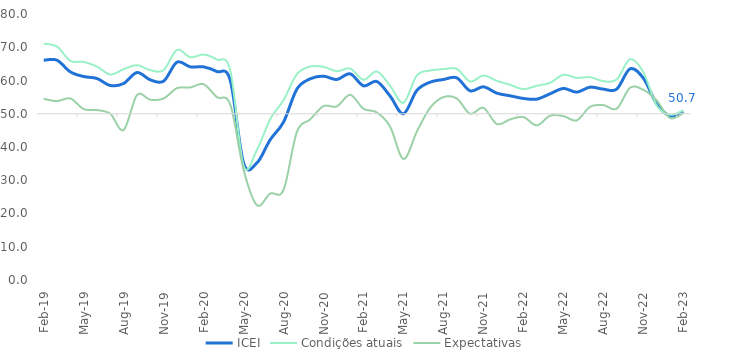
| Category | ICEI | Condições atuais | Expectativas |
|---|---|---|---|
| 2019-02-01 | 66.1 | 71.1 | 54.5 |
| 2019-03-01 | 66.1 | 70.2 | 53.8 |
| 2019-04-01 | 62.6 | 65.9 | 54.6 |
| 2019-05-01 | 61.2 | 65.6 | 51.4 |
| 2019-06-01 | 60.6 | 64.2 | 51.1 |
| 2019-07-01 | 58.5 | 61.8 | 50 |
| 2019-08-01 | 59.1 | 63.4 | 45.1 |
| 2019-09-01 | 62.4 | 64.6 | 55.6 |
| 2019-10-01 | 60.2 | 63.1 | 54.2 |
| 2019-11-01 | 59.8 | 63.1 | 54.6 |
| 2019-12-01 | 65.5 | 69.2 | 57.7 |
| 2020-01-01 | 64.1 | 67 | 57.9 |
| 2020-02-01 | 64.1 | 67.8 | 58.9 |
| 2020-03-01 | 62.7 | 66.3 | 55 |
| 2020-04-01 | 60.1 | 63.1 | 52.8 |
| 2020-05-01 | 35.2 | 34.4 | 33.2 |
| 2020-06-01 | 35.2 | 39.1 | 22.5 |
| 2020-07-01 | 42.2 | 48.4 | 26 |
| 2020-08-01 | 47.5 | 54.1 | 27.1 |
| 2020-09-01 | 57.4 | 61.9 | 44.5 |
| 2020-10-01 | 60.5 | 64.2 | 48.3 |
| 2020-11-01 | 61.3 | 64.1 | 52.3 |
| 2020-12-01 | 60.3 | 62.8 | 52.2 |
| 2021-01-01 | 62 | 63.6 | 55.7 |
| 2021-02-01 | 58.4 | 60.2 | 51.5 |
| 2021-03-01 | 59.7 | 62.7 | 50.4 |
| 2021-04-01 | 55.3 | 58.4 | 46.1 |
| 2021-05-01 | 50 | 53.3 | 36.4 |
| 2021-06-01 | 57 | 61.5 | 44.6 |
| 2021-07-01 | 59.5 | 63 | 51.8 |
| 2021-08-01 | 60.3 | 63.4 | 55 |
| 2021-09-01 | 60.8 | 63.5 | 54.6 |
| 2021-10-01 | 56.9 | 59.7 | 50 |
| 2021-11-01 | 58.1 | 61.5 | 51.8 |
| 2021-12-01 | 56.2 | 59.9 | 46.9 |
| 2022-01-01 | 55.4 | 58.7 | 48.3 |
| 2022-02-01 | 54.6 | 57.4 | 49 |
| 2022-03-01 | 54.4 | 58.4 | 46.5 |
| 2022-04-01 | 56 | 59.3 | 49.4 |
| 2022-05-01 | 57.6 | 61.7 | 49.3 |
| 2022-06-01 | 56.5 | 60.8 | 48 |
| 2022-07-01 | 58 | 61 | 52.1 |
| 2022-08-01 | 57.4 | 59.8 | 52.6 |
| 2022-09-01 | 57.4 | 60.3 | 51.5 |
| 2022-10-01 | 63.5 | 66.4 | 57.8 |
| 2022-11-01 | 60.7 | 62.5 | 57.2 |
| 2022-12-01 | 53 | 52.5 | 54 |
| 2023-01-01 | 49.4 | 49.7 | 48.7 |
| 2023-02-01 | 50.7 | 51 | 50.2 |